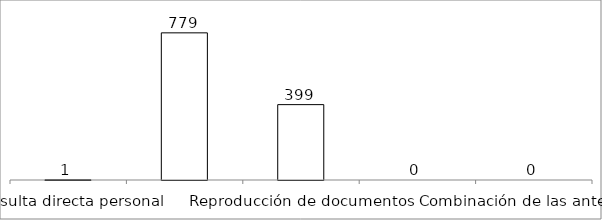
| Category | Series 0 |
|---|---|
| Consulta directa personal | 1 |
| Consulta directa electrónica | 779 |
| Reproducción de documentos | 399 |
| Elaboración de informes | 0 |
| Combinación de las anteriores | 0 |